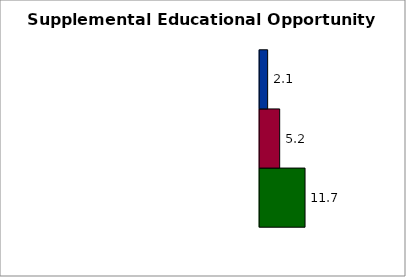
| Category | State | SREB states | 50 states and D.C. |
|---|---|---|---|
| 0 | 11.701 | 5.16 | 2.06 |